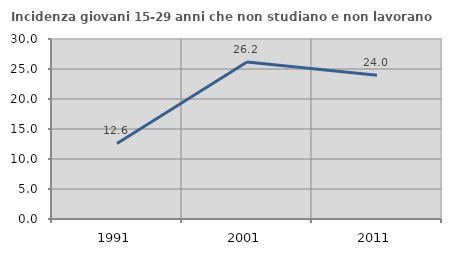
| Category | Incidenza giovani 15-29 anni che non studiano e non lavorano  |
|---|---|
| 1991.0 | 12.593 |
| 2001.0 | 26.153 |
| 2011.0 | 23.955 |